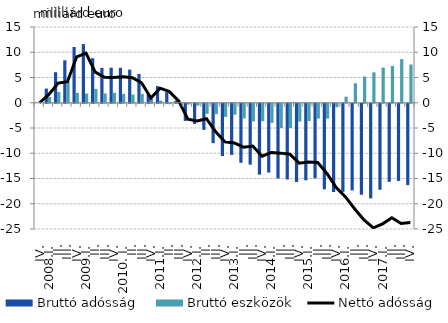
| Category | Bruttó adósság  | Bruttó eszközök |
|---|---|---|
| IV. | 0 | 0 |
| 2008.I. | 2.805 | 1.155 |
| II. | 6.047 | 2.144 |
| III. | 8.406 | 4.231 |
| IV. | 11.042 | 1.944 |
| 2009.I. | 11.619 | 1.806 |
| II. | 8.818 | 2.746 |
| III. | 6.896 | 1.845 |
| IV. | 6.949 | 1.95 |
| 2010. I. | 6.917 | 1.755 |
| II. | 6.567 | 1.624 |
| III. | 5.717 | 1.759 |
| IV. | 1.77 | 0.814 |
| 2011.I. | 3.302 | 0.409 |
| II. | 2.097 | -0.111 |
| III. | 0.433 | 0.067 |
| IV. | -3.394 | -0.148 |
| 2012.I. | -4 | -0.387 |
| II. | -5.171 | -2.014 |
| III. | -7.808 | -2.044 |
| IV. | -10.358 | -2.605 |
| 2013.I. | -10.129 | -2.176 |
| II. | -11.7 | -2.894 |
| III. | -12.051 | -3.475 |
| IV. | -14.044 | -3.451 |
| 2014.I. | -13.623 | -3.789 |
| II. | -14.796 | -4.82 |
| III. | -14.997 | -4.797 |
| IV. | -15.49 | -3.532 |
| 2015.I. | -15.157 | -3.419 |
| II. | -14.758 | -2.933 |
| III. | -16.939 | -2.933 |
| IV. | -17.484 | -0.69 |
| 2016.I. | -17.44 | 1.197 |
| II. | -17.159 | 3.873 |
| III. | -18.021 | 5.187 |
| IV. | -18.744 | 6.014 |
| 2017.I. | -17.03 | 6.955 |
| II. | -15.466 | 7.304 |
| III. | -15.286 | 8.638 |
| IV. | -16.112 | 7.579 |